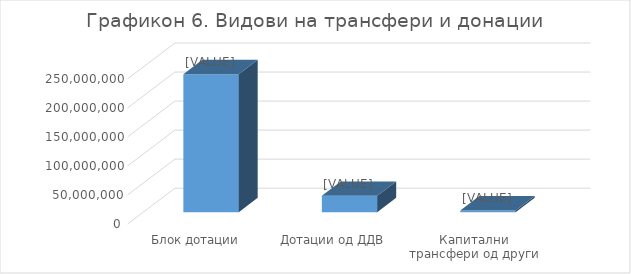
| Category | Износ |
|---|---|
| Блок дотации | 237697000 |
| Дотации од ДДВ | 28281000 |
| Капитални трансфери од други нивоа на власт | 2997000 |